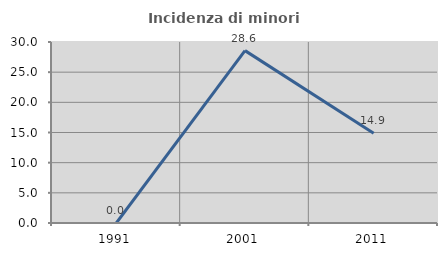
| Category | Incidenza di minori stranieri |
|---|---|
| 1991.0 | 0 |
| 2001.0 | 28.571 |
| 2011.0 | 14.865 |